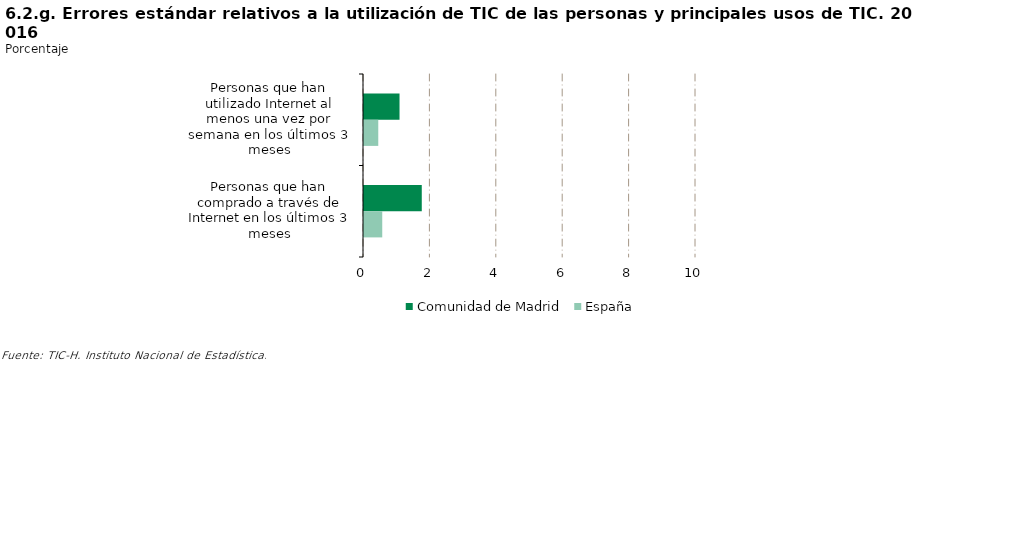
| Category | Comunidad de Madrid | España |
|---|---|---|
| Personas que han utilizado Internet al menos una vez por semana en los últimos 3 meses | 1.07 | 0.43 |
| Personas que han comprado a través de Internet en los últimos 3 meses | 1.74 | 0.55 |